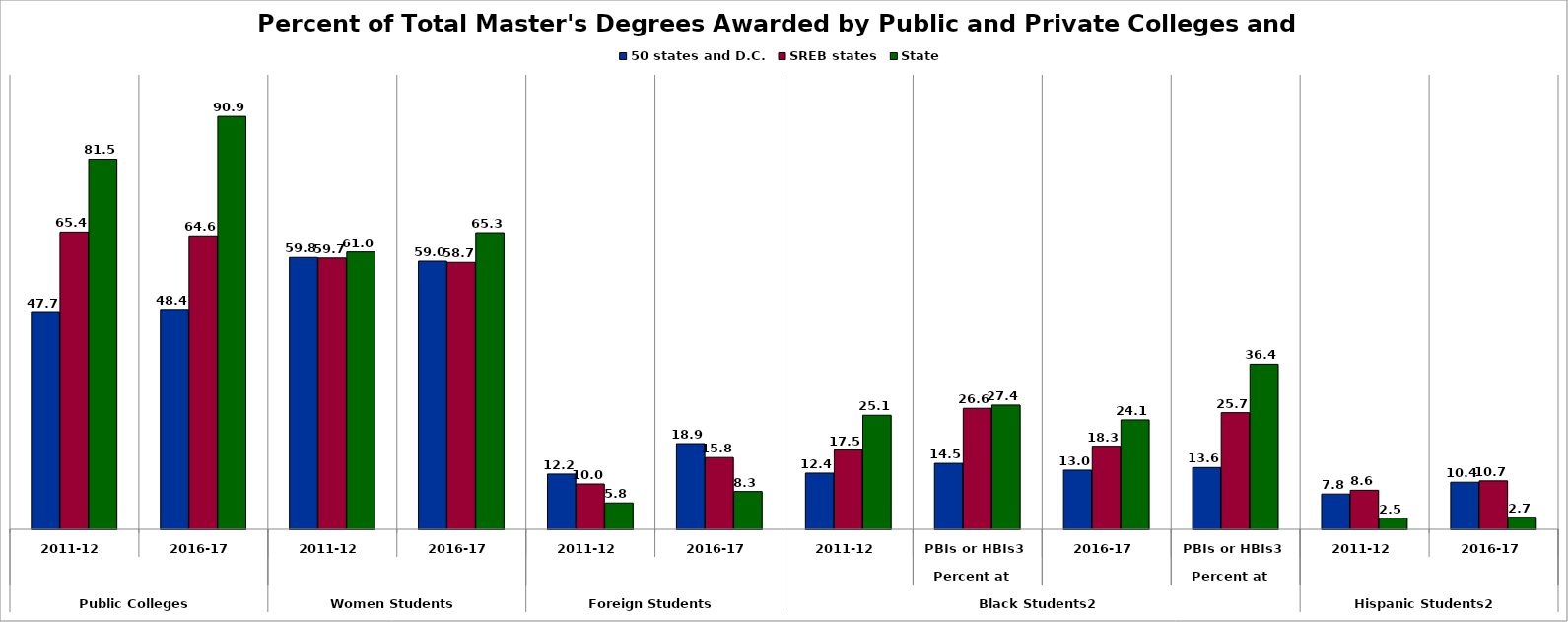
| Category | 50 states and D.C. | SREB states | State |
|---|---|---|---|
| 0 | 47.715 | 65.431 | 81.459 |
| 1 | 48.411 | 64.584 | 90.864 |
| 2 | 59.818 | 59.693 | 61.033 |
| 3 | 59.005 | 58.734 | 65.285 |
| 4 | 12.166 | 9.973 | 5.806 |
| 5 | 18.862 | 15.797 | 8.32 |
| 6 | 12.373 | 17.455 | 25.11 |
| 7 | 14.52 | 26.637 | 27.351 |
| 8 | 13.028 | 18.291 | 24.094 |
| 9 | 13.595 | 25.671 | 36.356 |
| 10 | 7.77 | 8.602 | 2.488 |
| 11 | 10.366 | 10.66 | 2.664 |